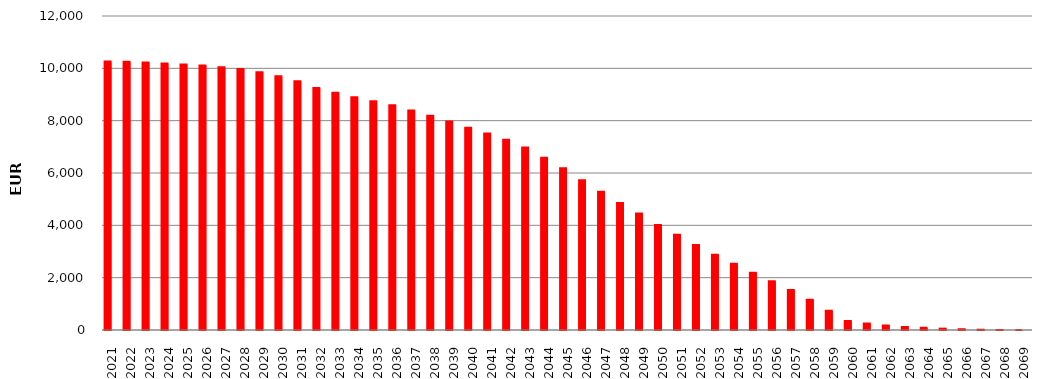
| Category | 10269094184 | SumOfMont Cred Ced act |
|---|---|---|
| 2021 | 10264070287.26 | 5023897.07 |
| 2022 | 10248440126.11 | 15630161.15 |
| 2023 | 10222022513.37 | 26417612.74 |
| 2024 | 10187691579.02 | 34330934.35 |
| 2025 | 10150959203.29 | 36732375.73 |
| 2026 | 10105340514.75 | 45618688.54 |
| 2027 | 10045810554.2 | 59529960.55 |
| 2028 | 9970162686.84 | 75647867.36 |
| 2029 | 9848585679.02 | 121577007.82 |
| 2030 | 9696749957.89 | 151835721.13 |
| 2031 | 9506552539.09 | 190197418.8 |
| 2032 | 9250140159.03 | 256412380.06 |
| 2033 | 9066073753.77 | 184066405.26 |
| 2034 | 8891283269.83 | 174790483.94 |
| 2035 | 8741730493.33 | 149552776.5 |
| 2036 | 8585501595.14 | 156228898.19 |
| 2037 | 8389575971.73 | 195925623.41 |
| 2038 | 8187746814.88 | 201829156.85 |
| 2039 | 7969263082.91 | 218483731.97 |
| 2040 | 7732820809.17 | 236442273.74 |
| 2041 | 7513461969.88 | 219358839.29 |
| 2042 | 7269117558.51 | 244344411.37 |
| 2043 | 6975349573.12 | 293767985.39 |
| 2044 | 6581126913.68 | 394222659.44 |
| 2045 | 6178529472.84 | 402597440.84 |
| 2046 | 5726317929.61 | 452211543.23 |
| 2047 | 5278764725.24 | 447553204.37 |
| 2048 | 4852402838.81 | 426361886.43 |
| 2049 | 4449700772.19 | 402702066.62 |
| 2050 | 4016172815.49 | 433527956.7 |
| 2051 | 3641379196.72 | 374793618.77 |
| 2052 | 3251723153.51 | 389656043.21 |
| 2053 | 2880240397.48 | 371482756.03 |
| 2054 | 2531709097.04 | 348531300.44 |
| 2055 | 2190539851.47 | 341169245.57 |
| 2056 | 1859796332.67 | 330743518.8 |
| 2057 | 1528632134.29 | 331164198.38 |
| 2058 | 1152018528.54 | 376613605.75 |
| 2059 | 732112294.57 | 419906233.97 |
| 2060 | 344358039.17 | 387754255.4 |
| 2061 | 244628521.86 | 99729517.31 |
| 2062 | 174469002.43 | 70159519.43 |
| 2063 | 117054958.47 | 57414043.96 |
| 2064 | 81363145.15 | 35691813.32 |
| 2065 | 51873325.17 | 29489819.98 |
| 2066 | 29525496.88 | 22347828.29 |
| 2067 | 11455016.05 | 18070480.83 |
| 2068 | 1099126.42 | 10355889.63 |
| 2069 | 0 | 1099126.42 |